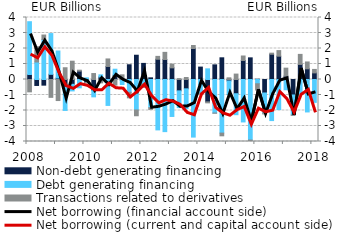
| Category | Non-debt generating financing | Debt generating financing | Transactions related to derivatives |
|---|---|---|---|
| 2008.0 | 0.322 | 3.407 | -0.797 |
| 2008.0 | -0.385 | 1.131 | 0.986 |
| 2008.0 | -0.364 | 2.578 | 0.292 |
| 2008.0 | 0.334 | 2.628 | -1.152 |
| 2009.0 | 0.096 | 1.742 | -1.358 |
| 2009.0 | -0.495 | -1.502 | 0.758 |
| 2009.0 | -0.31 | -0.426 | 1.181 |
| 2009.0 | 0.54 | -0.537 | 0.06 |
| 2010.0 | -0.188 | 0.108 | -0.028 |
| 2010.0 | -0.709 | -0.411 | 0.384 |
| 2010.0 | 0.167 | 0.134 | -0.216 |
| 2010.0 | 0.841 | -1.672 | 0.485 |
| 2011.0 | 0.279 | 0.384 | -0.362 |
| 2011.0 | -0.045 | -0.279 | 0.301 |
| 2011.0 | 0.951 | -0.827 | -0.355 |
| 2011.0 | 1.566 | -1.967 | -0.372 |
| 2012.0 | 1.038 | -0.282 | -0.228 |
| 2012.0 | 0.107 | -1.816 | -0.112 |
| 2012.0 | 1.307 | -3.251 | 0.185 |
| 2012.0 | 1.29 | -3.363 | 0.461 |
| 2013.0 | 0.752 | -2.385 | 0.238 |
| 2013.0 | -0.734 | -1.079 | 0.057 |
| 2013.0 | -0.601 | -1.268 | 0.129 |
| 2013.0 | 2.002 | -3.715 | 0.193 |
| 2014.0 | 0.8 | -0.873 | -0.015 |
| 2014.0 | -1.445 | 0.687 | -0.062 |
| 2014.0 | 0.944 | -2.164 | -0.012 |
| 2014.0 | 1.399 | -3.458 | -0.175 |
| 2015.0 | -0.094 | -0.877 | 0.108 |
| 2015.0 | -0.918 | -1.353 | 0.349 |
| 2015.0 | 1.228 | -2.738 | 0.289 |
| 2015.0 | 1.396 | -3.908 | -0.059 |
| 2016.0 | 0.018 | -0.276 | -0.406 |
| 2016.0 | -0.87 | -1.275 | -0.078 |
| 2016.0 | 1.629 | -2.651 | 0.07 |
| 2016.0 | 1.504 | -1.939 | 0.361 |
| 2017.0 | 0.218 | -0.661 | 0.515 |
| 2017.0 | -1 | -1.287 | -0.027 |
| 2017.0 | 0.971 | -0.914 | 0.649 |
| 2017.0 | 0.691 | -2.093 | 0.44 |
| 2018.0 | 0.426 | -1.475 | 0.224 |